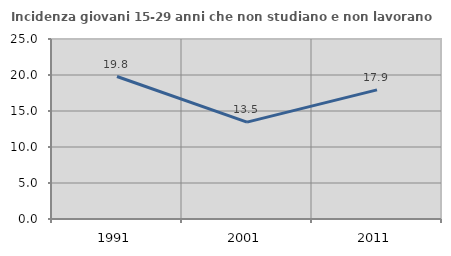
| Category | Incidenza giovani 15-29 anni che non studiano e non lavorano  |
|---|---|
| 1991.0 | 19.79 |
| 2001.0 | 13.457 |
| 2011.0 | 17.932 |